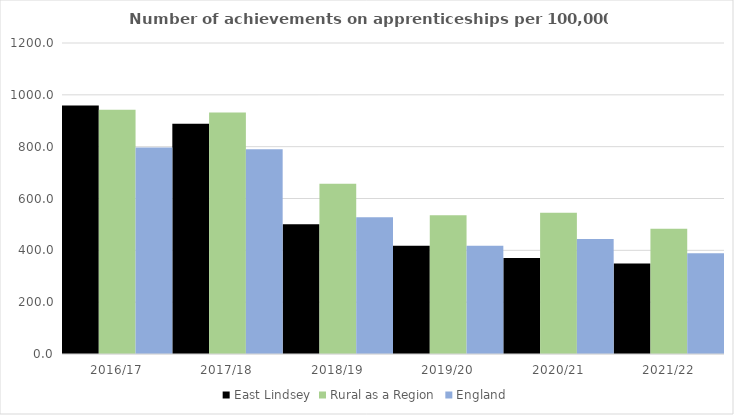
| Category | East Lindsey | Rural as a Region | England |
|---|---|---|---|
| 2016/17 | 959 | 942.594 | 797 |
| 2017/18 | 888 | 931.709 | 790 |
| 2018/19 | 501 | 656.44 | 528 |
| 2019/20 | 418 | 535.552 | 418 |
| 2020/21 | 370 | 545.333 | 444 |
| 2021/22 | 349 | 482.936 | 389 |